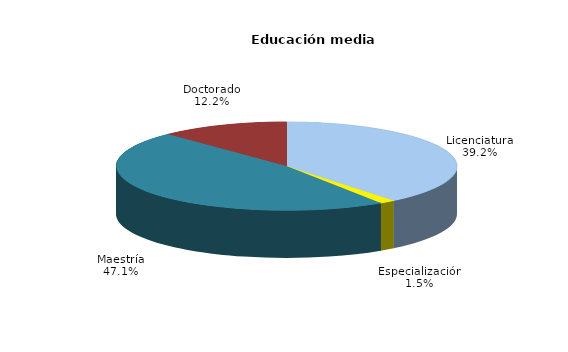
| Category | Series 0 |
|---|---|
| Licenciatura | 583 |
| Especialización | 22 |
| Maestría | 701 |
| Doctorado | 181 |